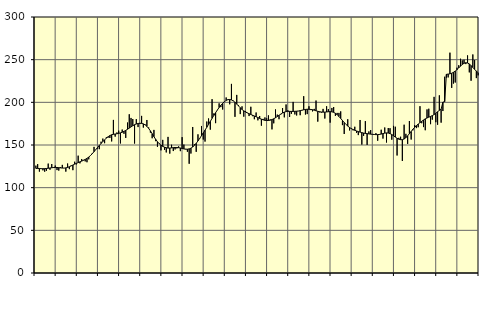
| Category | Piggar | Series 1 |
|---|---|---|
| nan | 125.8 | 122.56 |
| 1.0 | 127.6 | 122.56 |
| 1.0 | 118.8 | 122.42 |
| 1.0 | 121.9 | 122.25 |
| 1.0 | 120.3 | 122.22 |
| 1.0 | 118.7 | 122.3 |
| 1.0 | 119.8 | 122.47 |
| 1.0 | 128.2 | 122.77 |
| 1.0 | 121 | 123.06 |
| 1.0 | 127.7 | 123.35 |
| 1.0 | 124.1 | 123.57 |
| 1.0 | 125.9 | 123.68 |
| nan | 120.6 | 123.64 |
| 2.0 | 120 | 123.44 |
| 2.0 | 124.1 | 123.18 |
| 2.0 | 126.7 | 122.98 |
| 2.0 | 122.9 | 122.95 |
| 2.0 | 118.8 | 123.18 |
| 2.0 | 128.3 | 123.71 |
| 2.0 | 121.7 | 124.52 |
| 2.0 | 126 | 125.49 |
| 2.0 | 120.5 | 126.54 |
| 2.0 | 130.4 | 127.56 |
| 2.0 | 127.3 | 128.5 |
| nan | 137.5 | 129.38 |
| 3.0 | 128.5 | 130.25 |
| 3.0 | 133.6 | 131.14 |
| 3.0 | 132.5 | 132.06 |
| 3.0 | 130.8 | 133.1 |
| 3.0 | 129.8 | 134.35 |
| 3.0 | 133.2 | 135.86 |
| 3.0 | 137.5 | 137.66 |
| 3.0 | 140.5 | 139.8 |
| 3.0 | 147.8 | 142.14 |
| 3.0 | 144.9 | 144.6 |
| 3.0 | 145.8 | 147.07 |
| nan | 145.1 | 149.46 |
| 4.0 | 153.9 | 151.79 |
| 4.0 | 157.5 | 154.02 |
| 4.0 | 152.1 | 156.1 |
| 4.0 | 159.1 | 158.03 |
| 4.0 | 158.6 | 159.7 |
| 4.0 | 158.2 | 161.06 |
| 4.0 | 154.2 | 162 |
| 4.0 | 179.4 | 162.54 |
| 4.0 | 159.8 | 162.89 |
| 4.0 | 164.7 | 163.19 |
| 4.0 | 166.8 | 163.6 |
| nan | 151.8 | 164.21 |
| 5.0 | 168.1 | 164.99 |
| 5.0 | 163.1 | 165.95 |
| 5.0 | 158.3 | 167.12 |
| 5.0 | 176.3 | 168.43 |
| 5.0 | 186 | 169.81 |
| 5.0 | 181.7 | 171.21 |
| 5.0 | 180.4 | 172.59 |
| 5.0 | 151.7 | 173.77 |
| 5.0 | 180.3 | 174.64 |
| 5.0 | 171 | 175.23 |
| 5.0 | 174.9 | 175.48 |
| nan | 184.1 | 175.35 |
| 6.0 | 170.4 | 174.75 |
| 6.0 | 174.2 | 173.58 |
| 6.0 | 179.3 | 171.84 |
| 6.0 | 170.5 | 169.48 |
| 6.0 | 164.5 | 166.54 |
| 6.0 | 157.9 | 163.23 |
| 6.0 | 167.7 | 159.81 |
| 6.0 | 154.5 | 156.61 |
| 6.0 | 147.9 | 153.85 |
| 6.0 | 152.1 | 151.54 |
| 6.0 | 143.7 | 149.77 |
| nan | 156 | 148.41 |
| 7.0 | 144.3 | 147.41 |
| 7.0 | 141.3 | 146.77 |
| 7.0 | 159.5 | 146.42 |
| 7.0 | 139.9 | 146.39 |
| 7.0 | 150.3 | 146.63 |
| 7.0 | 142.9 | 146.92 |
| 7.0 | 144.8 | 147.08 |
| 7.0 | 146 | 147.07 |
| 7.0 | 148.4 | 146.86 |
| 7.0 | 142.8 | 146.49 |
| 7.0 | 159.2 | 145.96 |
| nan | 150.5 | 145.42 |
| 8.0 | 145.4 | 145.08 |
| 8.0 | 142.1 | 145.09 |
| 8.0 | 128 | 145.45 |
| 8.0 | 140 | 146.28 |
| 8.0 | 171.1 | 147.67 |
| 8.0 | 151 | 149.58 |
| 8.0 | 142 | 151.97 |
| 8.0 | 162.5 | 154.76 |
| 8.0 | 157.3 | 157.79 |
| 8.0 | 172.3 | 160.94 |
| 8.0 | 156.4 | 164.17 |
| nan | 154 | 167.43 |
| 9.0 | 177.5 | 170.73 |
| 9.0 | 181.1 | 174.14 |
| 9.0 | 168 | 177.69 |
| 9.0 | 203.7 | 181.24 |
| 9.0 | 187 | 184.62 |
| 9.0 | 175.6 | 187.88 |
| 9.0 | 190.9 | 191.01 |
| 9.0 | 198.8 | 193.94 |
| 9.0 | 194.4 | 196.57 |
| 9.0 | 191.6 | 198.85 |
| 9.0 | 200.5 | 200.74 |
| nan | 205.7 | 202.22 |
| 10.0 | 203.6 | 203.13 |
| 10.0 | 197.7 | 203.35 |
| 10.0 | 221.6 | 202.85 |
| 10.0 | 202.1 | 201.72 |
| 10.0 | 183 | 200.04 |
| 10.0 | 208.7 | 197.99 |
| 10.0 | 196.9 | 195.77 |
| 10.0 | 186.2 | 193.58 |
| 10.0 | 195.3 | 191.62 |
| 10.0 | 183.2 | 190 |
| 10.0 | 189.7 | 188.7 |
| nan | 187.9 | 187.63 |
| 11.0 | 183.9 | 186.67 |
| 11.0 | 194.8 | 185.77 |
| 11.0 | 183.8 | 184.88 |
| 11.0 | 180.2 | 183.99 |
| 11.0 | 188.1 | 183.1 |
| 11.0 | 178.9 | 182.17 |
| 11.0 | 184 | 181.18 |
| 11.0 | 172.6 | 180.26 |
| 11.0 | 180.6 | 179.48 |
| 11.0 | 182.3 | 178.93 |
| 11.0 | 181.3 | 178.66 |
| nan | 184.7 | 178.7 |
| 12.0 | 180 | 179.06 |
| 12.0 | 168.3 | 179.78 |
| 12.0 | 175.4 | 180.75 |
| 12.0 | 191.7 | 181.96 |
| 12.0 | 185.6 | 183.34 |
| 12.0 | 180.2 | 184.79 |
| 12.0 | 185.8 | 186.24 |
| 12.0 | 193.3 | 187.54 |
| 12.0 | 182.4 | 188.52 |
| 12.0 | 197.5 | 189.11 |
| 12.0 | 190.7 | 189.38 |
| nan | 182.8 | 189.41 |
| 13.0 | 186.5 | 189.36 |
| 13.0 | 200.5 | 189.35 |
| 13.0 | 185.8 | 189.46 |
| 13.0 | 184.6 | 189.61 |
| 13.0 | 189.7 | 189.85 |
| 13.0 | 184.9 | 190.25 |
| 13.0 | 190.4 | 190.76 |
| 13.0 | 207.2 | 191.26 |
| 13.0 | 185.7 | 191.67 |
| 13.0 | 186.2 | 191.91 |
| 13.0 | 195.4 | 191.87 |
| nan | 190.9 | 191.67 |
| 14.0 | 189.4 | 191.3 |
| 14.0 | 192.3 | 190.75 |
| 14.0 | 202.1 | 190.1 |
| 14.0 | 177.4 | 189.51 |
| 14.0 | 188.3 | 189.03 |
| 14.0 | 187.9 | 188.68 |
| 14.0 | 192.3 | 188.51 |
| 14.0 | 181 | 188.54 |
| 14.0 | 195.4 | 188.73 |
| 14.0 | 192.1 | 188.97 |
| 14.0 | 176.2 | 189.09 |
| nan | 193.4 | 188.89 |
| 15.0 | 194.5 | 188.27 |
| 15.0 | 184.1 | 187.13 |
| 15.0 | 187.6 | 185.47 |
| 15.0 | 187.6 | 183.43 |
| 15.0 | 189.4 | 181.13 |
| 15.0 | 173.3 | 178.72 |
| 15.0 | 162.9 | 176.38 |
| 15.0 | 174 | 174.15 |
| 15.0 | 180.2 | 172.21 |
| 15.0 | 167.1 | 170.56 |
| 15.0 | 169.8 | 169.22 |
| nan | 167.2 | 168.16 |
| 16.0 | 171.4 | 167.25 |
| 16.0 | 164.3 | 166.44 |
| 16.0 | 161.6 | 165.74 |
| 16.0 | 179.3 | 165.11 |
| 16.0 | 150.5 | 164.49 |
| 16.0 | 160.7 | 163.96 |
| 16.0 | 178 | 163.55 |
| 16.0 | 150.1 | 163.27 |
| 16.0 | 165.9 | 163.01 |
| 16.0 | 167.5 | 162.73 |
| 16.0 | 162.9 | 162.52 |
| nan | 162.3 | 162.33 |
| 17.0 | 163.9 | 162.16 |
| 17.0 | 155 | 162.17 |
| 17.0 | 161.9 | 162.4 |
| 17.0 | 167.9 | 162.8 |
| 17.0 | 157.5 | 163.36 |
| 17.0 | 170.5 | 163.91 |
| 17.0 | 152.9 | 164.16 |
| 17.0 | 169.9 | 164 |
| 17.0 | 169.7 | 163.37 |
| 17.0 | 156.2 | 162.26 |
| 17.0 | 172.4 | 160.83 |
| nan | 171.4 | 159.28 |
| 18.0 | 137.7 | 157.86 |
| 18.0 | 158.4 | 156.81 |
| 18.0 | 159.7 | 156.24 |
| 18.0 | 131.3 | 156.26 |
| 18.0 | 173.8 | 157.01 |
| 18.0 | 163.1 | 158.58 |
| 18.0 | 151.3 | 160.75 |
| 18.0 | 178.1 | 163.27 |
| 18.0 | 156.4 | 165.89 |
| 18.0 | 167.2 | 168.46 |
| 18.0 | 173.3 | 170.75 |
| nan | 169.8 | 172.71 |
| 19.0 | 170.8 | 174.53 |
| 19.0 | 195.5 | 176.22 |
| 19.0 | 175.5 | 177.78 |
| 19.0 | 171 | 179.3 |
| 19.0 | 167.3 | 180.63 |
| 19.0 | 191.7 | 181.67 |
| 19.0 | 192.5 | 182.62 |
| 19.0 | 174.4 | 183.48 |
| 19.0 | 179.7 | 184.43 |
| 19.0 | 206.4 | 185.68 |
| 19.0 | 176.7 | 187.25 |
| nan | 173.7 | 188.96 |
| 20.0 | 208.2 | 190.59 |
| 20.0 | 176.2 | 191.89 |
| 20.0 | 189.8 | 200.2 |
| 20.0 | 230 | 200.76 |
| 20.0 | 229 | 232.85 |
| 20.0 | 229.2 | 233.11 |
| 20.0 | 258.2 | 233.41 |
| 20.0 | 216.9 | 234.08 |
| 20.0 | 222 | 235.18 |
| 20.0 | 223.2 | 236.59 |
| 20.0 | 240.6 | 238.31 |
| nan | 243.5 | 240.36 |
| 21.0 | 251.1 | 242.46 |
| 21.0 | 249.2 | 244.33 |
| 21.0 | 249.9 | 245.77 |
| 21.0 | 244.8 | 246.42 |
| 21.0 | 255 | 246.1 |
| 21.0 | 235.1 | 244.97 |
| 21.0 | 225.3 | 243.14 |
| 21.0 | 256.1 | 240.88 |
| 21.0 | 249.6 | 238.64 |
| 21.0 | 228.4 | 236.55 |
| 21.0 | 231.6 | 234.71 |